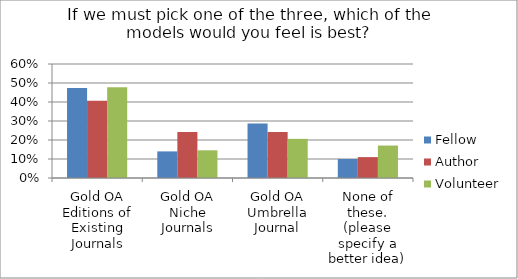
| Category | Fellow | Author | Volunteer |
|---|---|---|---|
| Gold OA Editions of Existing Journals | 0.473 | 0.407 | 0.477 |
| Gold OA Niche Journals | 0.14 | 0.242 | 0.146 |
| Gold OA Umbrella Journal | 0.287 | 0.242 | 0.206 |
| None of these. (please specify a better idea) | 0.1 | 0.11 | 0.171 |